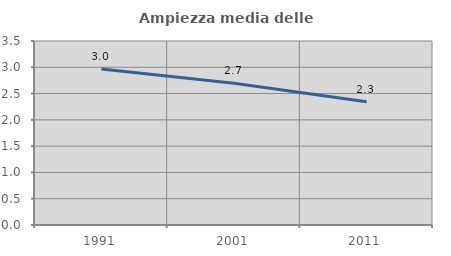
| Category | Ampiezza media delle famiglie |
|---|---|
| 1991.0 | 2.965 |
| 2001.0 | 2.694 |
| 2011.0 | 2.343 |